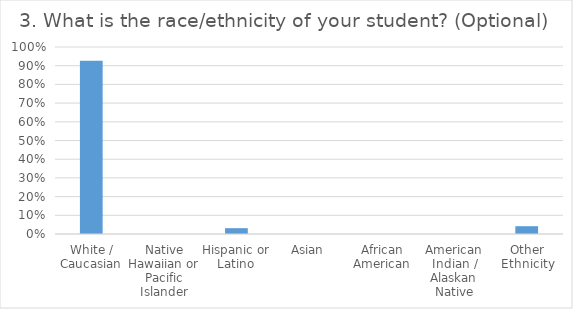
| Category | 3. What is the race/ethnicity of your student? (Optional)  |
|---|---|
| White / Caucasian | 0.927 |
| Native Hawaiian or Pacific Islander | 0 |
| Hispanic or Latino | 0.031 |
| Asian | 0 |
| African American | 0 |
| American Indian / Alaskan Native | 0 |
| Other Ethnicity | 0.042 |